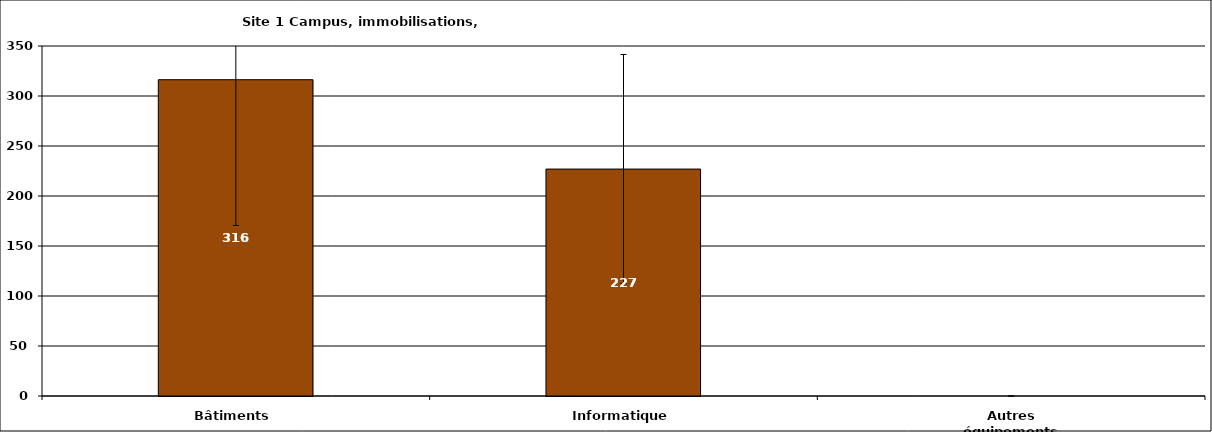
| Category | Series 0 |
|---|---|
| Bâtiments | 316.311 |
| Informatique | 226.927 |
| Autres équipements | 0 |